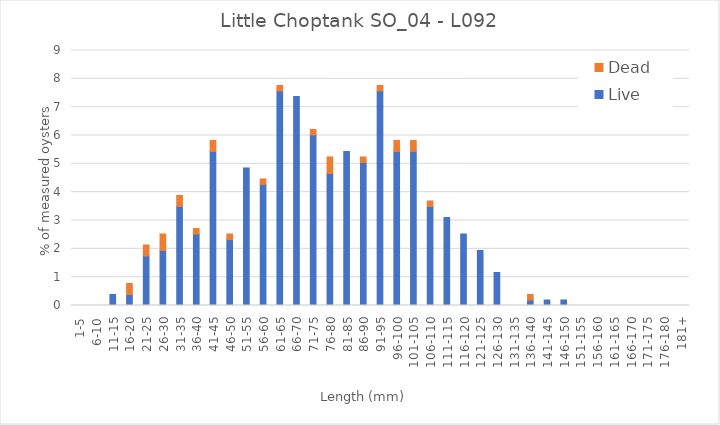
| Category | Live | Dead |
|---|---|---|
| 1-5 | 0 | 0 |
| 6-10 | 0 | 0 |
| 11-15 | 0.388 | 0 |
| 16-20 | 0.388 | 0.388 |
| 21-25 | 1.748 | 0.388 |
| 26-30 | 1.942 | 0.583 |
| 31-35 | 3.495 | 0.388 |
| 36-40 | 2.524 | 0.194 |
| 41-45 | 5.437 | 0.388 |
| 46-50 | 2.33 | 0.194 |
| 51-55 | 4.854 | 0 |
| 56-60 | 4.272 | 0.194 |
| 61-65 | 7.573 | 0.194 |
| 66-70 | 7.379 | 0 |
| 71-75 | 6.019 | 0.194 |
| 76-80 | 4.66 | 0.583 |
| 81-85 | 5.437 | 0 |
| 86-90 | 5.049 | 0.194 |
| 91-95 | 7.573 | 0.194 |
| 96-100 | 5.437 | 0.388 |
| 101-105 | 5.437 | 0.388 |
| 106-110 | 3.495 | 0.194 |
| 111-115 | 3.107 | 0 |
| 116-120 | 2.524 | 0 |
| 121-125 | 1.942 | 0 |
| 126-130 | 1.165 | 0 |
| 131-135 | 0 | 0 |
| 136-140 | 0.194 | 0.194 |
| 141-145 | 0.194 | 0 |
| 146-150 | 0.194 | 0 |
| 151-155 | 0 | 0 |
| 156-160 | 0 | 0 |
| 161-165 | 0 | 0 |
| 166-170 | 0 | 0 |
| 171-175 | 0 | 0 |
| 176-180 | 0 | 0 |
| 181+ | 0 | 0 |